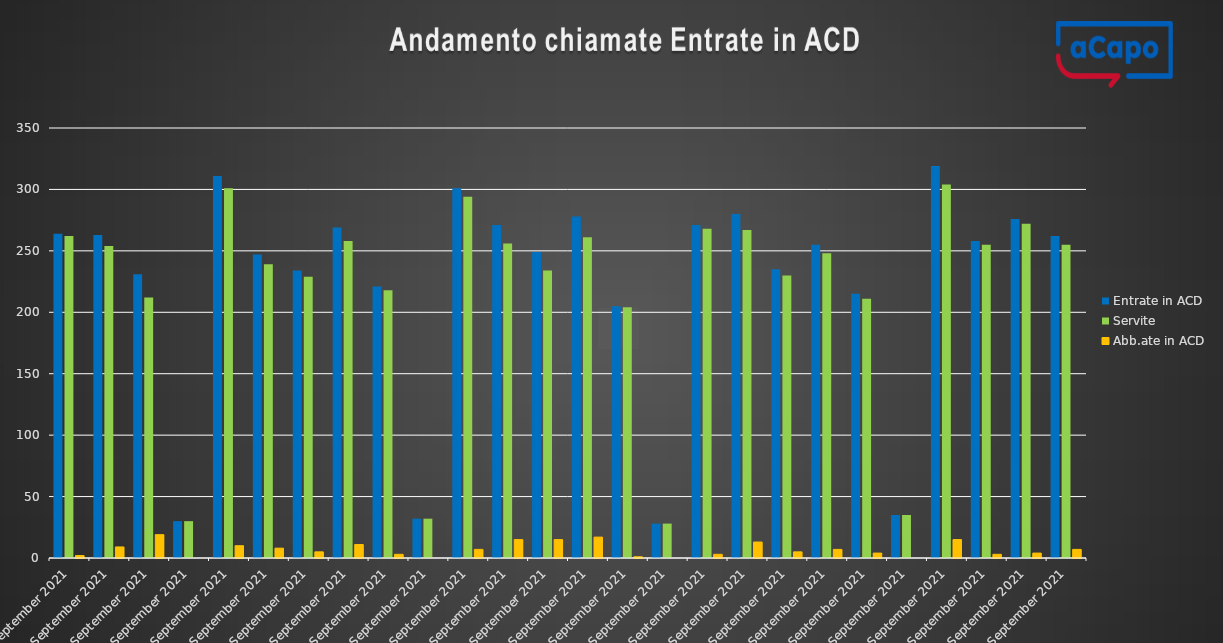
| Category | Entrate in ACD | Servite | Abb.ate in ACD |
|---|---|---|---|
| 2021-09-01 | 264 | 262 | 2 |
| 2021-09-02 | 263 | 254 | 9 |
| 2021-09-03 | 231 | 212 | 19 |
| 2021-09-04 | 30 | 30 | 0 |
| 2021-09-06 | 311 | 301 | 10 |
| 2021-09-07 | 247 | 239 | 8 |
| 2021-09-08 | 234 | 229 | 5 |
| 2021-09-09 | 269 | 258 | 11 |
| 2021-09-10 | 221 | 218 | 3 |
| 2021-09-11 | 32 | 32 | 0 |
| 2021-09-13 | 301 | 294 | 7 |
| 2021-09-14 | 271 | 256 | 15 |
| 2021-09-15 | 249 | 234 | 15 |
| 2021-09-16 | 278 | 261 | 17 |
| 2021-09-17 | 205 | 204 | 1 |
| 2021-09-18 | 28 | 28 | 0 |
| 2021-09-20 | 271 | 268 | 3 |
| 2021-09-21 | 280 | 267 | 13 |
| 2021-09-22 | 235 | 230 | 5 |
| 2021-09-23 | 255 | 248 | 7 |
| 2021-09-24 | 215 | 211 | 4 |
| 2021-09-25 | 35 | 35 | 0 |
| 2021-09-27 | 319 | 304 | 15 |
| 2021-09-28 | 258 | 255 | 3 |
| 2021-09-29 | 276 | 272 | 4 |
| 2021-09-30 | 262 | 255 | 7 |